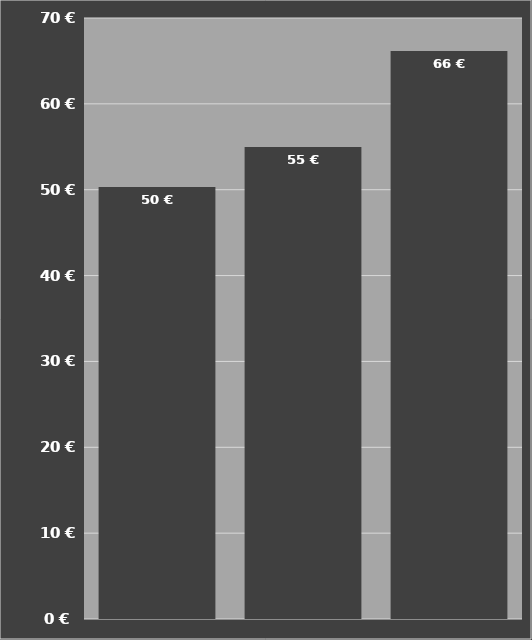
| Category | Kosten je Stunde |
|---|---|
| Tandem-Dreiseitenkipper TDK 1100 - 11 to | 50.326 |
| Tandem-Dreiseitenkipper TDK 1300 - 15 to | 54.962 |